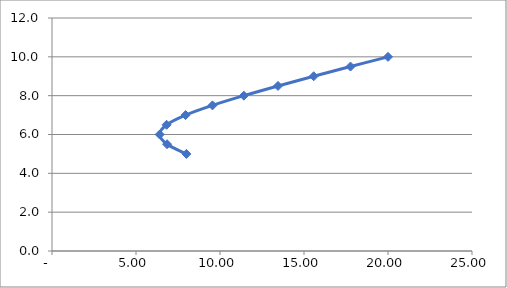
| Category | Series 0 |
|---|---|
| 8.0 | 5 |
| 6.849233533761278 | 5.5 |
| 6.409992199683242 | 6 |
| 6.821143599133506 | 6.5 |
| 7.951855129465073 | 7 |
| 9.549869109050658 | 7.5 |
| 11.420682991835472 | 8 |
| 13.450947921986762 | 8.5 |
| 15.57844664913675 | 9 |
| 17.768286355189122 | 9.5 |
| 20.0 | 10 |